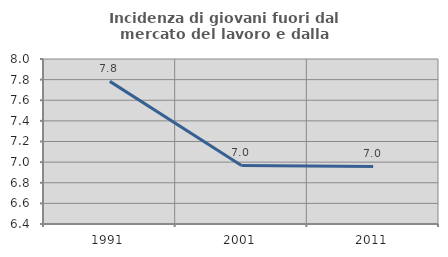
| Category | Incidenza di giovani fuori dal mercato del lavoro e dalla formazione  |
|---|---|
| 1991.0 | 7.783 |
| 2001.0 | 6.968 |
| 2011.0 | 6.958 |